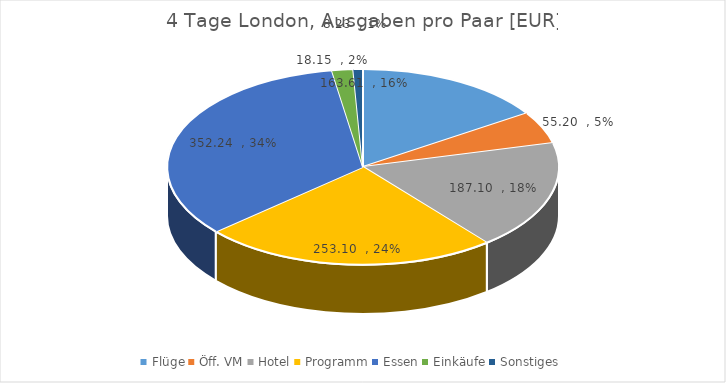
| Category | Series 0 |
|---|---|
| Flüge | 163.605 |
| Öff. VM | 55.2 |
| Hotel | 187.095 |
| Programm | 253.095 |
| Essen | 352.24 |
| Einkäufe | 18.15 |
| Sonstiges | 8.23 |